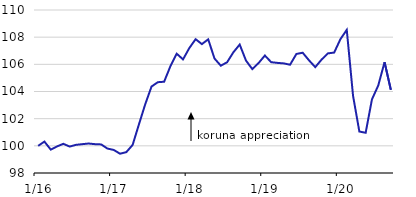
| Category | NEER |
|---|---|
|  1/16 | 100 |
| 2 | 100.311 |
| 3 | 99.722 |
| 4 | 99.957 |
| 5 | 100.15 |
| 6 | 99.945 |
| 7 | 100.072 |
| 8 | 100.122 |
| 9 | 100.17 |
| 10 | 100.124 |
| 11 | 100.104 |
| 12 | 99.8 |
|  1/17 | 99.698 |
| 2 | 99.42 |
| 3 | 99.537 |
| 4 | 100.066 |
| 5 | 101.576 |
| 6 | 103.059 |
| 7 | 104.365 |
| 8 | 104.685 |
| 9 | 104.718 |
| 10 | 105.861 |
| 11 | 106.783 |
| 12 | 106.363 |
|  1/18 | 107.196 |
| 2 | 107.851 |
| 3 | 107.488 |
| 4 | 107.841 |
| 5 | 106.429 |
| 6 | 105.9 |
| 7 | 106.152 |
| 8 | 106.888 |
| 9 | 107.457 |
| 10 | 106.277 |
| 11 | 105.651 |
| 12 | 106.095 |
|  1/19 | 106.648 |
| 2 | 106.159 |
| 3 | 106.106 |
| 4 | 106.069 |
| 5 | 105.972 |
| 6 | 106.761 |
| 7 | 106.855 |
| 8 | 106.297 |
| 9 | 105.794 |
| 10 | 106.349 |
| 11 | 106.806 |
| 12 | 106.866 |
|  1/20 | 107.859 |
| 2 | 108.539 |
| 3 | 103.677 |
| 4 | 101.053 |
| 5 | 100.962 |
| 6 | 103.422 |
| 7 | 104.443 |
| 8 | 106.158 |
| 9 | 104.124 |